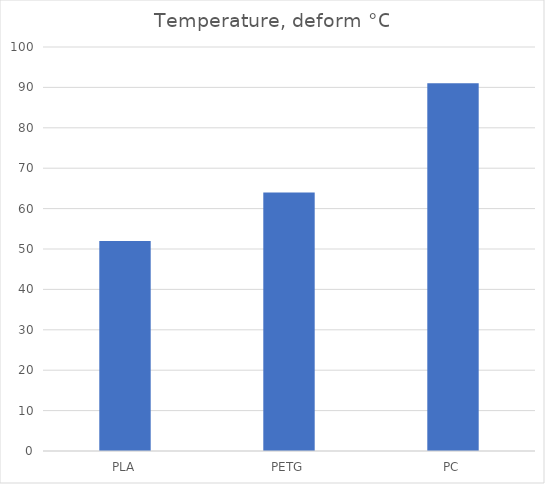
| Category | Deform °C |
|---|---|
| PLA | 52 |
| PETG | 64 |
| PC | 91 |